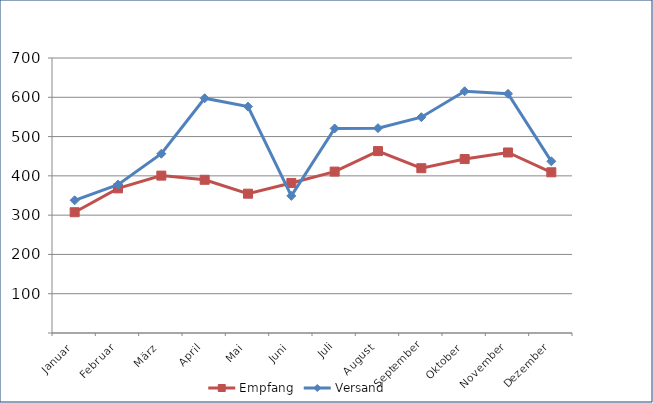
| Category | Empfang | Versand |
|---|---|---|
| Januar | 307.434 | 337.808 |
| Februar | 368.129 | 377.714 |
| März | 400.609 | 456.376 |
| April | 390.047 | 597.505 |
| Mai | 354.58 | 576.235 |
| Juni | 381.964 | 348.992 |
| Juli | 410.861 | 520.659 |
| August | 463.008 | 521.436 |
| September | 419.463 | 549.351 |
| Oktober | 442.825 | 615.354 |
| November | 459.496 | 608.871 |
| Dezember | 409.109 | 437.012 |